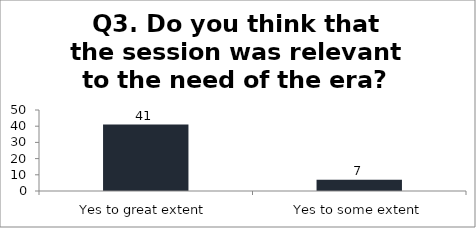
| Category | Q3. Do you think that the session was relevant to the need of the era? |
|---|---|
| Yes to great extent | 41 |
| Yes to some extent | 7 |